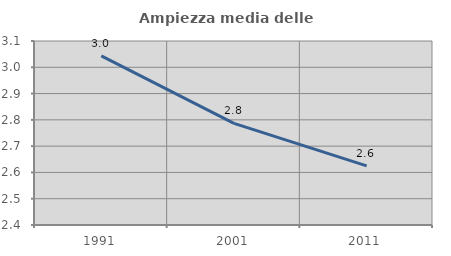
| Category | Ampiezza media delle famiglie |
|---|---|
| 1991.0 | 3.043 |
| 2001.0 | 2.786 |
| 2011.0 | 2.625 |